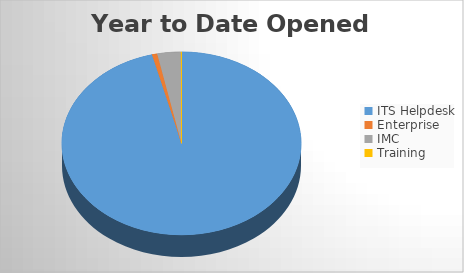
| Category | YTD Opened Tickets | 6M Opened |
|---|---|---|
| ITS Helpdesk | 3239 | 1973 |
| Enterprise | 24 | 15 |
| IMC | 107 | 58 |
| Training | 3 | 3 |